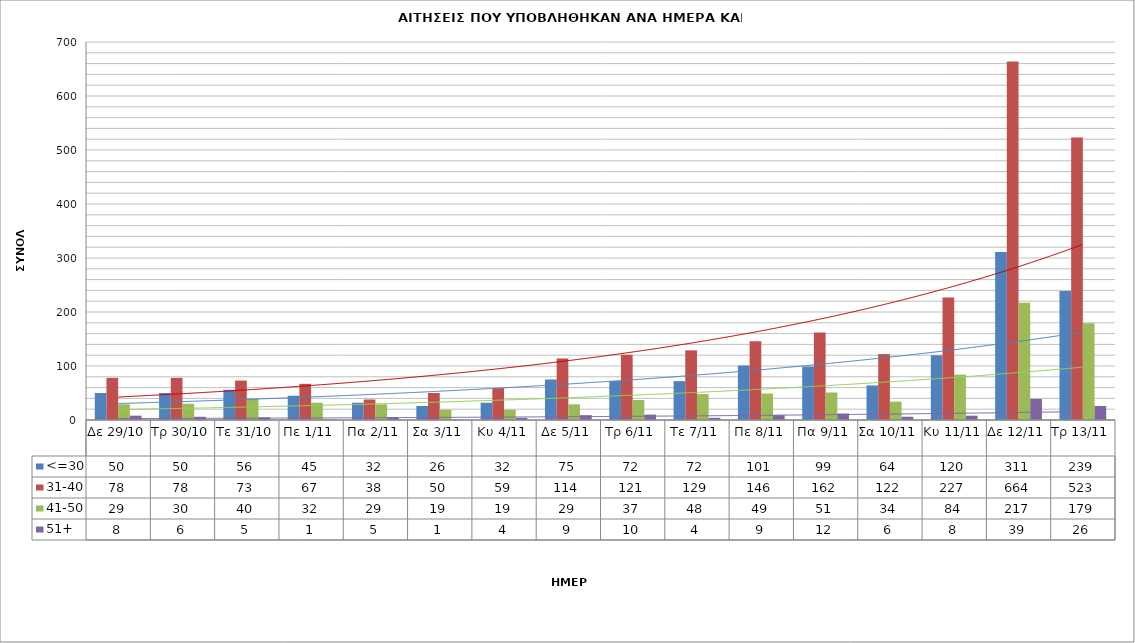
| Category | <=30 | 31-40 | 41-50 | 51+ |
|---|---|---|---|---|
| Δε 29/10 | 50 | 78 | 29 | 8 |
| Τρ 30/10 | 50 | 78 | 30 | 6 |
| Τε 31/10 | 56 | 73 | 40 | 5 |
| Πε 1/11 | 45 | 67 | 32 | 1 |
| Πα 2/11 | 32 | 38 | 29 | 5 |
| Σα 3/11 | 26 | 50 | 19 | 1 |
| Κυ 4/11 | 32 | 59 | 19 | 4 |
| Δε 5/11 | 75 | 114 | 29 | 9 |
| Τρ 6/11 | 72 | 121 | 37 | 10 |
| Τε 7/11 | 72 | 129 | 48 | 4 |
| Πε 8/11 | 101 | 146 | 49 | 9 |
| Πα 9/11 | 99 | 162 | 51 | 12 |
| Σα 10/11 | 64 | 122 | 34 | 6 |
| Κυ 11/11 | 120 | 227 | 84 | 8 |
| Δε 12/11 | 311 | 664 | 217 | 39 |
| Τρ 13/11 | 239 | 523 | 179 | 26 |